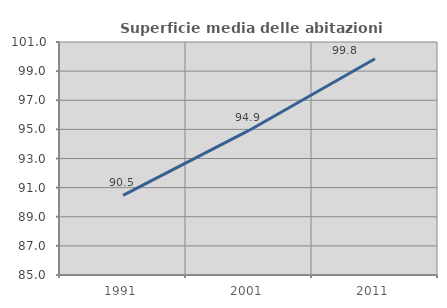
| Category | Superficie media delle abitazioni occupate |
|---|---|
| 1991.0 | 90.467 |
| 2001.0 | 94.927 |
| 2011.0 | 99.85 |